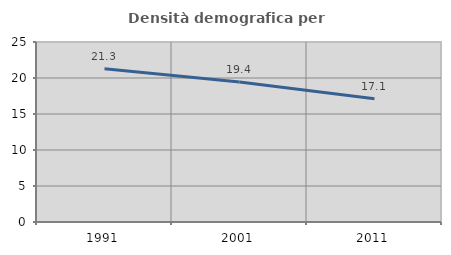
| Category | Densità demografica |
|---|---|
| 1991.0 | 21.269 |
| 2001.0 | 19.447 |
| 2011.0 | 17.118 |